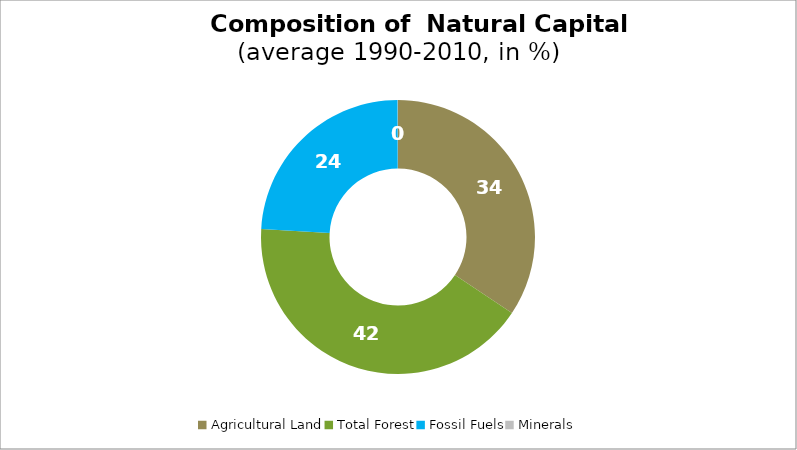
| Category | Series 0 |
|---|---|
| Agricultural Land | 34.372 |
| Total Forest | 41.571 |
| Fossil Fuels | 24.018 |
| Minerals | 0.039 |